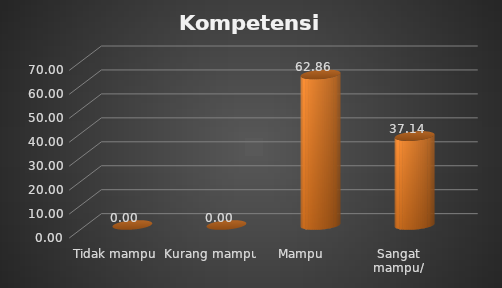
| Category | Kompetensi Petugas |
|---|---|
| Tidak mampu | 0 |
| Kurang mampu   | 0 |
| Mampu  | 62.857 |
| Sangat mampu/ terampil | 37.143 |